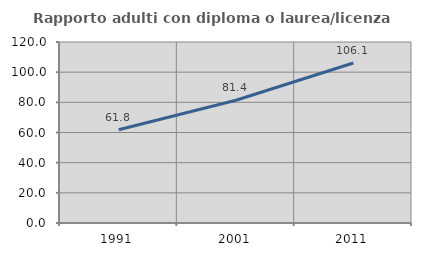
| Category | Rapporto adulti con diploma o laurea/licenza media  |
|---|---|
| 1991.0 | 61.842 |
| 2001.0 | 81.373 |
| 2011.0 | 106.061 |